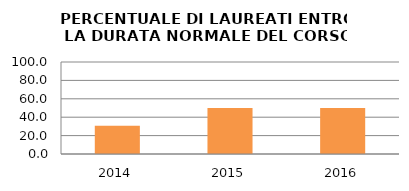
| Category | 2014 2015 2016 |
|---|---|
| 2014.0 | 30.769 |
| 2015.0 | 50 |
| 2016.0 | 50 |